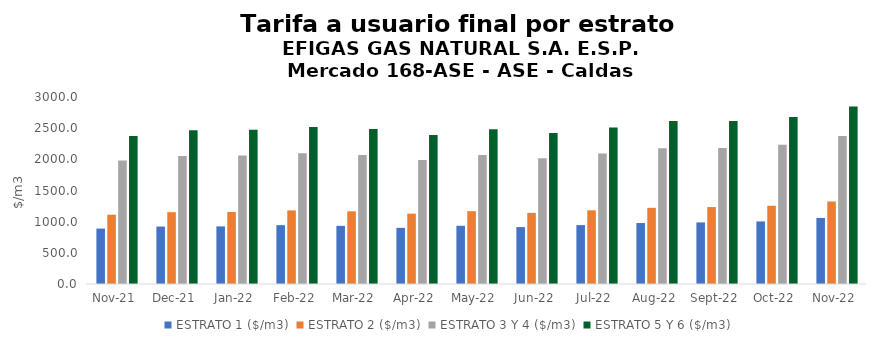
| Category | ESTRATO 1 ($/m3) | ESTRATO 2 ($/m3) | ESTRATO 3 Y 4 ($/m3) | ESTRATO 5 Y 6 ($/m3) |
|---|---|---|---|---|
| 2021-11-01 | 889.08 | 1111.91 | 1980.02 | 2376.024 |
| 2021-12-01 | 921.46 | 1152.18 | 2054.23 | 2465.076 |
| 2022-01-01 | 924.14 | 1156.04 | 2062.48 | 2474.976 |
| 2022-02-01 | 944.04 | 1180.34 | 2097.94 | 2517.528 |
| 2022-03-01 | 932.97 | 1166.33 | 2071.37 | 2485.644 |
| 2022-04-01 | 900.71 | 1128.96 | 1991.18 | 2389.416 |
| 2022-05-01 | 934.06 | 1168.18 | 2068.29 | 2481.948 |
| 2022-06-01 | 912.8 | 1141.29 | 2017.99 | 2421.588 |
| 2022-07-01 | 944.85 | 1181.63 | 2092.55 | 2511.06 |
| 2022-08-01 | 978.13 | 1222.23 | 2179.73 | 2615.676 |
| 2022-09-01 | 988.13 | 1234.73 | 2180.8 | 2616.96 |
| 2022-10-01 | 1004.17 | 1255.69 | 2233.24 | 2679.888 |
| 2022-11-01 | 1059.41 | 1324.26 | 2374.06 | 2848.872 |